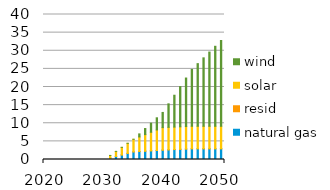
| Category | natural gas | resid | solar | wind |
|---|---|---|---|---|
| 2020.0 | 0 | 0 | 0 | 0 |
| 2021.0 | 0 | 0 | 0 | 0 |
| 2022.0 | 0 | 0 | 0 | 0 |
| 2023.0 | 0 | 0 | 0 | 0 |
| 2024.0 | 0 | 0 | 0 | 0 |
| 2025.0 | 0 | 0 | 0 | 0 |
| 2026.0 | 0 | 0 | 0 | 0 |
| 2027.0 | 0 | 0 | 0 | 0 |
| 2028.0 | 0 | 0 | 0 | 0 |
| 2029.0 | 0 | 0 | 0 | 0 |
| 2030.0 | 0 | 0 | 0 | 0 |
| 2031.0 | 0.423 | 0 | 0.693 | 0 |
| 2032.0 | 0.847 | 0.001 | 1.385 | 0 |
| 2033.0 | 1.27 | 0.001 | 2.078 | 0 |
| 2034.0 | 1.693 | 0.001 | 2.771 | 0 |
| 2035.0 | 2.117 | 0.002 | 3.463 | 0 |
| 2036.0 | 2.213 | 0.002 | 4.01 | 0.838 |
| 2037.0 | 2.309 | 0.002 | 4.556 | 1.675 |
| 2038.0 | 2.405 | 0.002 | 5.103 | 2.513 |
| 2039.0 | 2.501 | 0.002 | 5.649 | 3.35 |
| 2040.0 | 2.597 | 0.002 | 6.195 | 4.188 |
| 2041.0 | 2.672 | 0.002 | 6.195 | 6.487 |
| 2042.0 | 2.746 | 0.002 | 6.195 | 8.785 |
| 2043.0 | 2.82 | 0.002 | 6.195 | 11.084 |
| 2044.0 | 2.895 | 0.002 | 6.195 | 13.383 |
| 2045.0 | 2.969 | 0.002 | 6.195 | 15.681 |
| 2046.0 | 2.969 | 0.002 | 6.195 | 17.277 |
| 2047.0 | 2.969 | 0.002 | 6.195 | 18.873 |
| 2048.0 | 2.969 | 0.002 | 6.195 | 20.469 |
| 2049.0 | 2.969 | 0.002 | 6.195 | 22.065 |
| 2050.0 | 2.969 | 0.002 | 6.195 | 23.661 |